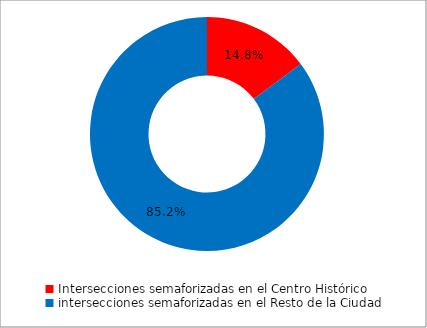
| Category | Series 0 |
|---|---|
| Intersecciones semaforizadas en el Centro Histórico | 0.148 |
| intersecciones semaforizadas en el Resto de la Ciudad | 0.852 |